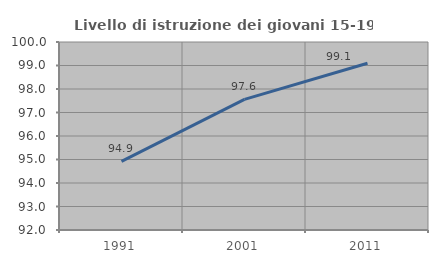
| Category | Livello di istruzione dei giovani 15-19 anni |
|---|---|
| 1991.0 | 94.917 |
| 2001.0 | 97.561 |
| 2011.0 | 99.093 |